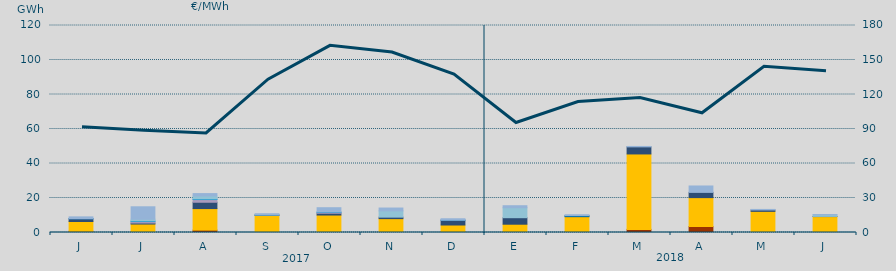
| Category | Carbón | Ciclo Combinado | Cogeneración | Consumo Bombeo | Enlace Península Baleares | Eólica | Hidráulica | Internacionales | Solar fotovoltaica | Turbinación bombeo |
|---|---|---|---|---|---|---|---|---|---|---|
| J | 673.2 | 5702.5 | 0 | 1567.6 | 28.4 | 0 | 149.4 | 0 | 0 | 940.1 |
| J | 0 | 4906.7 | 0 | 593.2 | 844.1 | 0 | 376.7 | 973.2 | 0 | 7214.8 |
| A | 1372.5 | 12488.5 | 0 | 3675.7 | 1561.2 | 0 | 359.5 | 1700.4 | 0 | 1397.9 |
| S | 0 | 9962.3 | 0 | 123.8 | 0 | 0 | 40 | 0 | 0 | 759.3 |
| O | 0 | 10119.2 | 0 | 1038.2 | 495.2 | 0 | 208.4 | 0 | 0 | 2510.5 |
| N | 0 | 8034.3 | 0 | 863.8 | 0 | 0 | 0 | 3635.7 | 0 | 1650.6 |
| D | 374 | 3967.2 | 0 | 2746.1 | 58.6 | 0 | 52.1 | 0 | 0 | 774.9 |
| E | 0 | 4799.8 | 0 | 3776.1 | 0 | 0 | 0 | 5766.5 | 0 | 1181.9 |
| F | 0 | 9167.2 | 0 | 319.8 | 0 | 0 | 367.5 | 0 | 0 | 436 |
| M | 1806.7 | 43724.8 | 0 | 4108.1 | 0 | 0 | 0 | 0 | 0 | 249 |
| A | 3485.4 | 16735.1 | 0 | 3030.8 | 0 | 0 | 0 | 0 | 0 | 3717.6 |
| M | 0 | 12256.8 | 0 | 795.1 | 0 | 0 | 0 | 0 | 0 | 330.9 |
| J | 0 | 9234.9 | 0 | 91.5 | 0 | 0 | 0 | 976 | 0 | 107.7 |